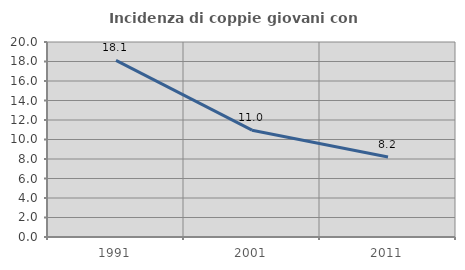
| Category | Incidenza di coppie giovani con figli |
|---|---|
| 1991.0 | 18.118 |
| 2001.0 | 10.953 |
| 2011.0 | 8.211 |